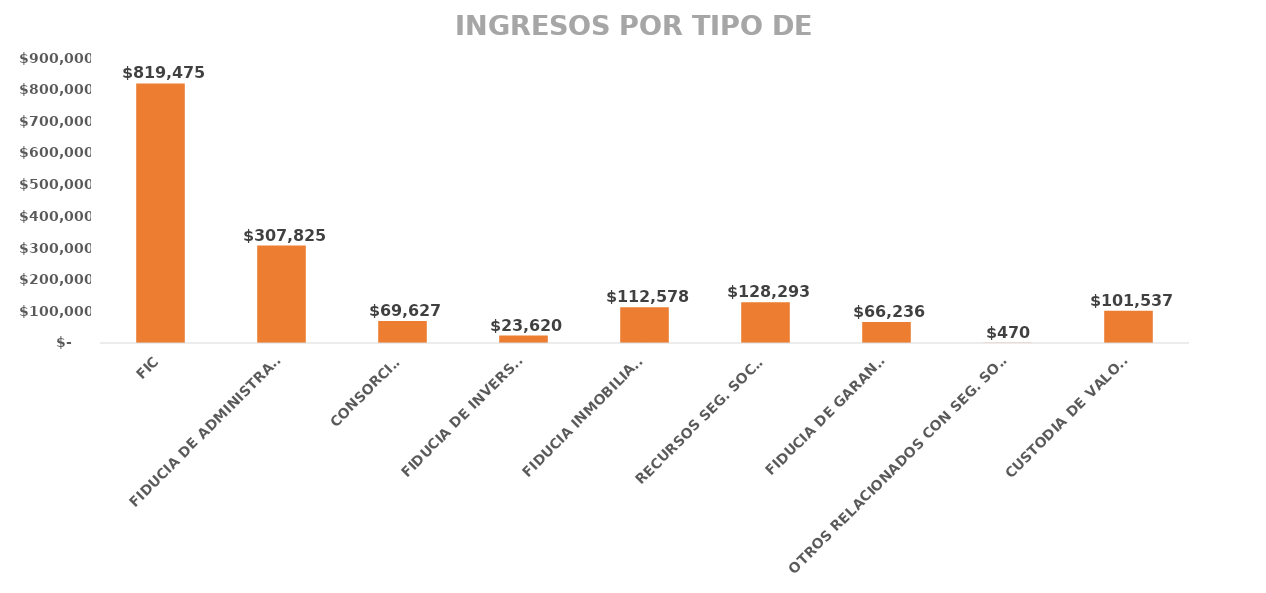
| Category | Series 0 |
|---|---|
| FIC | 819475.331 |
| FIDUCIA DE ADMINISTRACIÓN | 307825.36 |
| CONSORCIOS | 69626.97 |
| FIDUCIA DE INVERSION | 23619.815 |
| FIDUCIA INMOBILIARIA | 112578.237 |
| RECURSOS SEG. SOCIAL | 128293.387 |
| FIDUCIA DE GARANTIA | 66236.184 |
| OTROS RELACIONADOS CON SEG. SOCIAL  | 470.23 |
| CUSTODIA DE VALORES | 101537.15 |